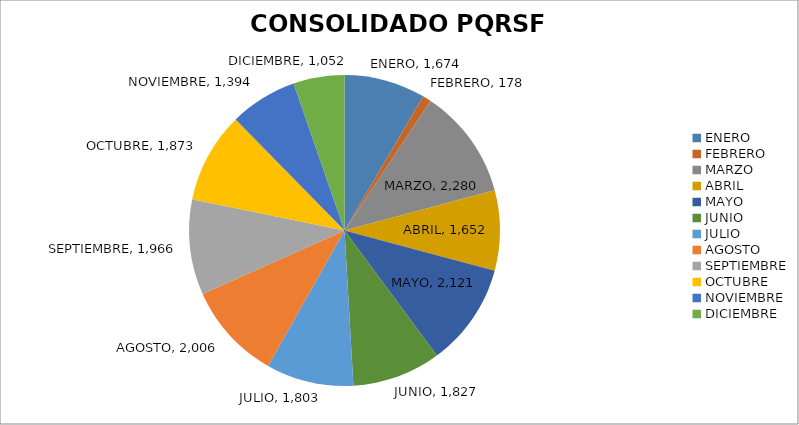
| Category | PQRS  |
|---|---|
| ENERO | 1674 |
| FEBRERO | 178 |
| MARZO | 2280 |
| ABRIL | 1652 |
| MAYO | 2121 |
| JUNIO | 1827 |
| JULIO | 1803 |
| AGOSTO | 2006 |
| SEPTIEMBRE | 1966 |
| OCTUBRE | 1873 |
| NOVIEMBRE | 1394 |
| DICIEMBRE | 1052 |